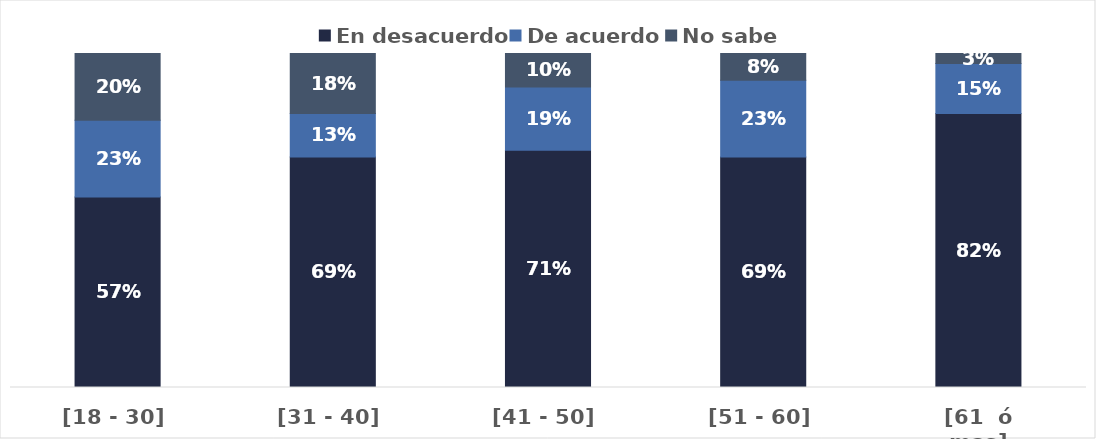
| Category | En desacuerdo | De acuerdo | No sabe |
|---|---|---|---|
| [18 - 30] | 0.57 | 0.23 | 0.2 |
| [31 - 40] | 0.69 | 0.13 | 0.18 |
| [41 - 50] | 0.71 | 0.19 | 0.1 |
| [51 - 60] | 0.69 | 0.23 | 0.08 |
| [61  ó mas] | 0.82 | 0.15 | 0.03 |